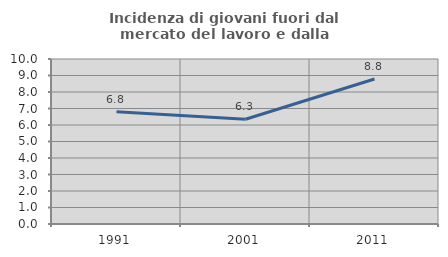
| Category | Incidenza di giovani fuori dal mercato del lavoro e dalla formazione  |
|---|---|
| 1991.0 | 6.803 |
| 2001.0 | 6.345 |
| 2011.0 | 8.788 |